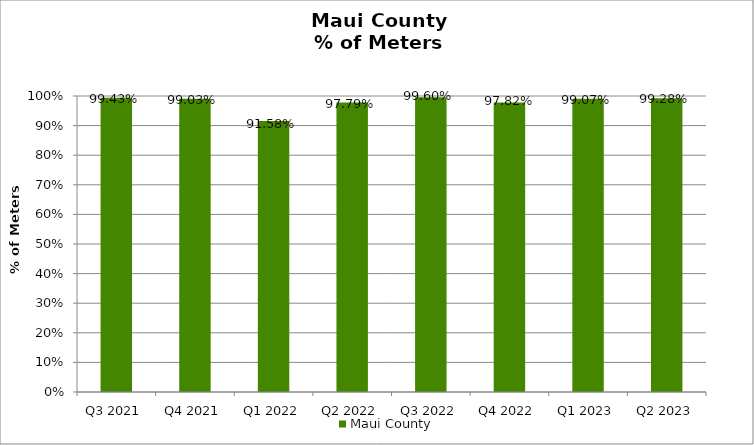
| Category | Maui County |
|---|---|
| Q3 2021 | 0.994 |
| Q4 2021 | 0.99 |
| Q1 2022 | 0.916 |
| Q2 2022 | 0.978 |
| Q3 2022 | 0.996 |
| Q4 2022 | 0.978 |
| Q1 2023 | 0.991 |
| Q2 2023 | 0.993 |